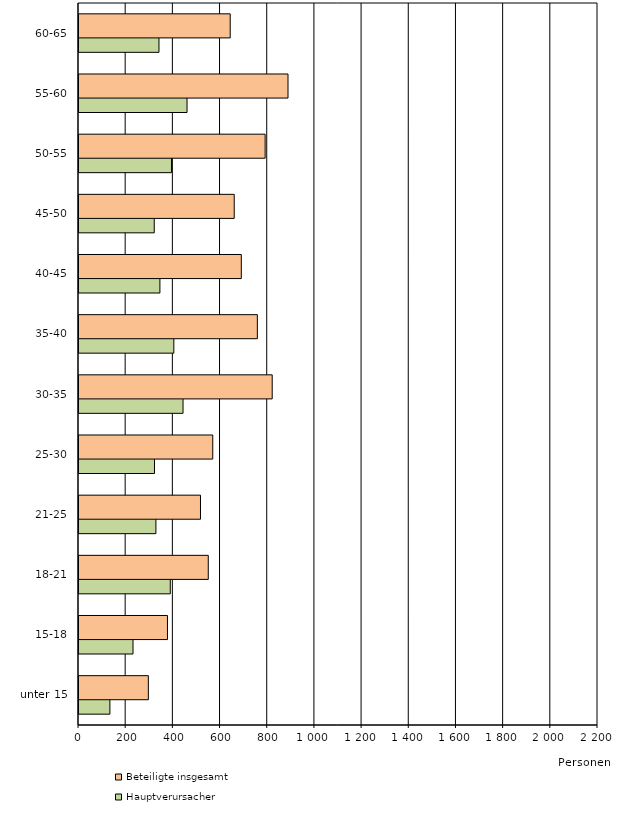
| Category |     Hauptverursacher |     Beteiligte insgesamt |
|---|---|---|
| 0 | 131 | 294 |
| 1 | 229 | 375 |
| 2 | 387 | 548 |
| 3 | 326 | 515 |
| 4 | 320 | 567 |
| 5 | 441 | 819 |
| 6 | 402 | 756 |
| 7 | 343 | 688 |
| 8 | 319 | 658 |
| 9 | 392 | 789 |
| 10 | 458 | 886 |
| 11 | 339 | 641 |